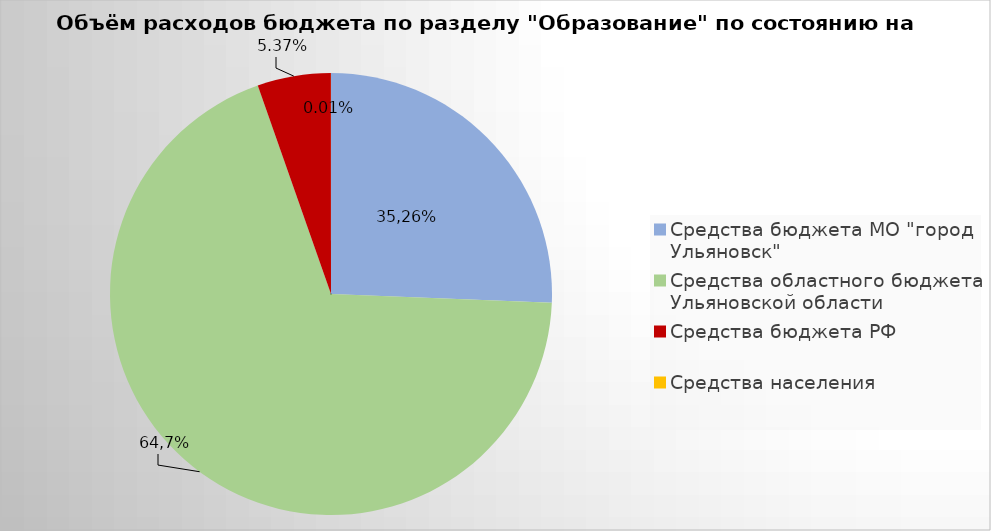
| Category | Series 0 |
|---|---|
| Средства бюджета МО "город Ульяновск" | 2299157.42 |
| Средства областного бюджета Ульяновской области | 6187191.27 |
| Средства бюджета РФ | 481508.6 |
| Средства населения | 558.01 |